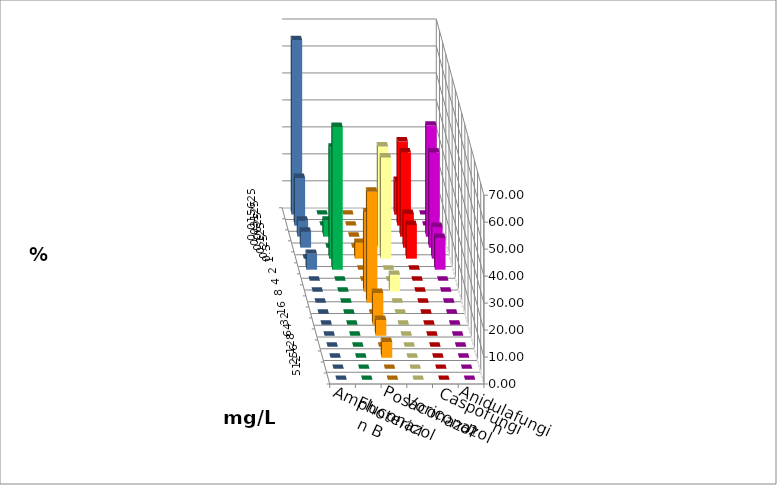
| Category | Amphotericin B | Fluconazol | Posaconazol | Voriconazol | Caspofungin | Anidulafungin |
|---|---|---|---|---|---|---|
| 0.015625 | 0 | 0 | 0 | 12.5 | 0 | 64.706 |
| 0.03125 | 0 | 0 | 6.25 | 31.25 | 0 | 17.647 |
| 0.0625 | 5.882 | 0 | 12.5 | 31.25 | 41.176 | 5.882 |
| 0.125 | 0 | 0 | 37.5 | 12.5 | 35.294 | 5.882 |
| 0.25 | 41.176 | 5.882 | 37.5 | 12.5 | 11.765 | 0 |
| 0.5 | 52.941 | 0 | 0 | 0 | 11.765 | 5.882 |
| 1.0 | 0 | 0 | 0 | 0 | 0 | 0 |
| 2.0 | 0 | 29.412 | 6.25 | 0 | 0 | 0 |
| 4.0 | 0 | 41.176 | 0 | 0 | 0 | 0 |
| 8.0 | 0 | 0 | 0 | 0 | 0 | 0 |
| 16.0 | 0 | 11.765 | 0 | 0 | 0 | 0 |
| 32.0 | 0 | 5.882 | 0 | 0 | 0 | 0 |
| 64.0 | 0 | 0 | 0 | 0 | 0 | 0 |
| 128.0 | 0 | 5.882 | 0 | 0 | 0 | 0 |
| 256.0 | 0 | 0 | 0 | 0 | 0 | 0 |
| 512.0 | 0 | 0 | 0 | 0 | 0 | 0 |